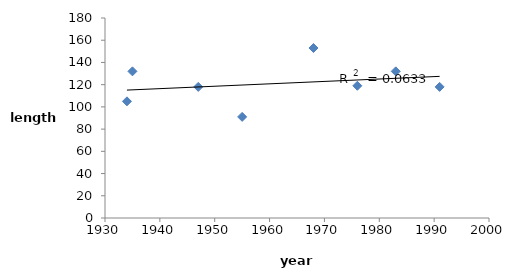
| Category | x2i |
|---|---|
| 1991.0 | 118 |
| 1983.0 | 132 |
| 1976.0 | 119 |
| 1968.0 | 153 |
| 1955.0 | 91 |
| 1947.0 | 118 |
| 1935.0 | 132 |
| 1934.0 | 105 |